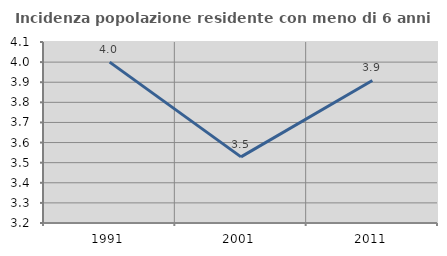
| Category | Incidenza popolazione residente con meno di 6 anni |
|---|---|
| 1991.0 | 4 |
| 2001.0 | 3.529 |
| 2011.0 | 3.909 |